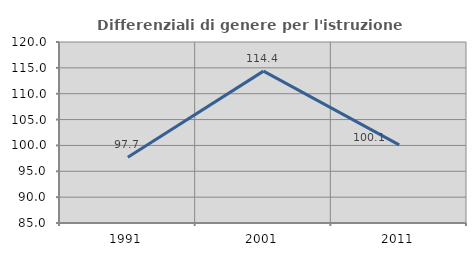
| Category | Differenziali di genere per l'istruzione superiore |
|---|---|
| 1991.0 | 97.724 |
| 2001.0 | 114.366 |
| 2011.0 | 100.12 |